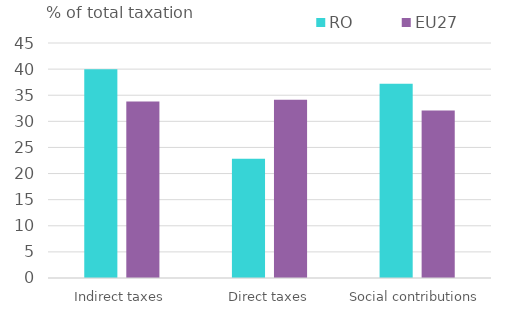
| Category | RO | EU27 |
|---|---|---|
| Indirect taxes | 39.972 | 33.811 |
| Direct taxes | 22.846 | 34.133 |
| Social contributions | 37.182 | 32.056 |